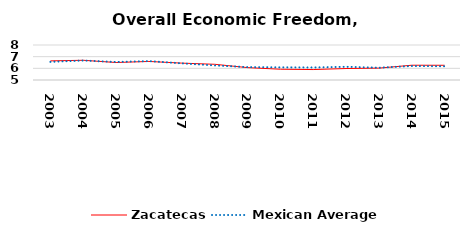
| Category | Zacatecas | Mexican Average  |
|---|---|---|
| 2003.0 | 6.64 | 6.552 |
| 2004.0 | 6.691 | 6.668 |
| 2005.0 | 6.498 | 6.546 |
| 2006.0 | 6.591 | 6.619 |
| 2007.0 | 6.446 | 6.428 |
| 2008.0 | 6.347 | 6.248 |
| 2009.0 | 6.062 | 6.106 |
| 2010.0 | 5.923 | 6.086 |
| 2011.0 | 5.896 | 6.074 |
| 2012.0 | 5.983 | 6.134 |
| 2013.0 | 6.017 | 6.054 |
| 2014.0 | 6.267 | 6.2 |
| 2015.0 | 6.263 | 6.174 |